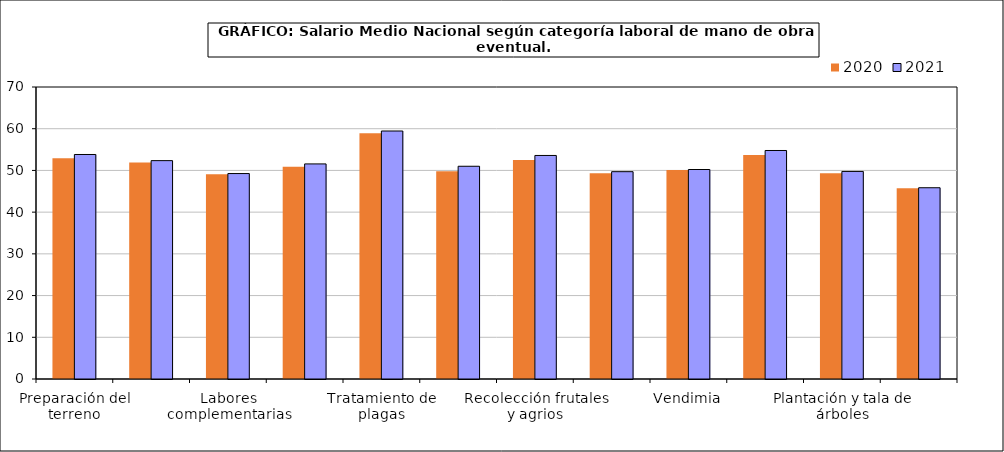
| Category | 2020 | 2021 |
|---|---|---|
| 0 | 52.9 | 53.82 |
| 1 | 51.89 | 52.35 |
| 2 | 49.09 | 49.25 |
| 3 | 50.87 | 51.56 |
| 4 | 58.94 | 59.45 |
| 5 | 49.82 | 51 |
| 6 | 52.48 | 53.59 |
| 7 | 49.31 | 49.7 |
| 8 | 50.11 | 50.22 |
| 9 | 53.72 | 54.78 |
| 10 | 49.31 | 49.76 |
| 11 | 45.75 | 45.85 |